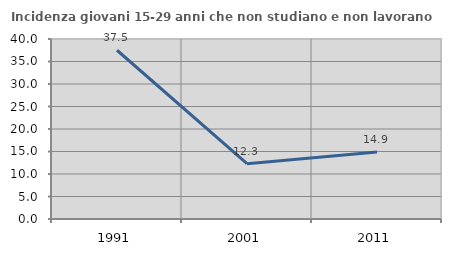
| Category | Incidenza giovani 15-29 anni che non studiano e non lavorano  |
|---|---|
| 1991.0 | 37.5 |
| 2001.0 | 12.281 |
| 2011.0 | 14.894 |